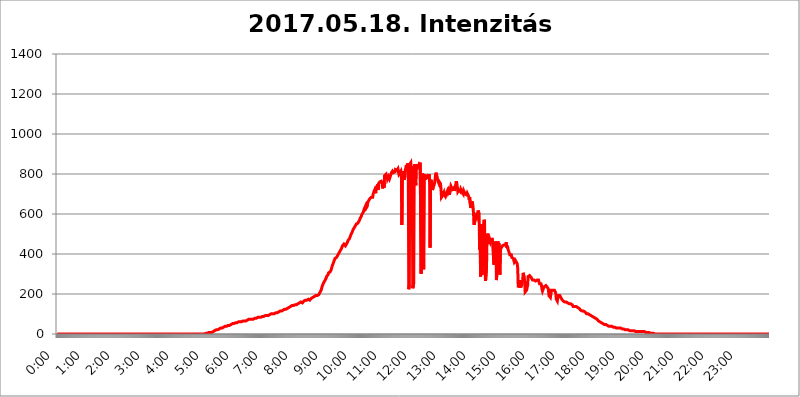
| Category | 2017.05.18. Intenzitás [W/m^2] |
|---|---|
| 0.0 | 0 |
| 0.0006944444444444445 | 0 |
| 0.001388888888888889 | 0 |
| 0.0020833333333333333 | 0 |
| 0.002777777777777778 | 0 |
| 0.003472222222222222 | 0 |
| 0.004166666666666667 | 0 |
| 0.004861111111111111 | 0 |
| 0.005555555555555556 | 0 |
| 0.0062499999999999995 | 0 |
| 0.006944444444444444 | 0 |
| 0.007638888888888889 | 0 |
| 0.008333333333333333 | 0 |
| 0.009027777777777779 | 0 |
| 0.009722222222222222 | 0 |
| 0.010416666666666666 | 0 |
| 0.011111111111111112 | 0 |
| 0.011805555555555555 | 0 |
| 0.012499999999999999 | 0 |
| 0.013194444444444444 | 0 |
| 0.013888888888888888 | 0 |
| 0.014583333333333332 | 0 |
| 0.015277777777777777 | 0 |
| 0.015972222222222224 | 0 |
| 0.016666666666666666 | 0 |
| 0.017361111111111112 | 0 |
| 0.018055555555555557 | 0 |
| 0.01875 | 0 |
| 0.019444444444444445 | 0 |
| 0.02013888888888889 | 0 |
| 0.020833333333333332 | 0 |
| 0.02152777777777778 | 0 |
| 0.022222222222222223 | 0 |
| 0.02291666666666667 | 0 |
| 0.02361111111111111 | 0 |
| 0.024305555555555556 | 0 |
| 0.024999999999999998 | 0 |
| 0.025694444444444447 | 0 |
| 0.02638888888888889 | 0 |
| 0.027083333333333334 | 0 |
| 0.027777777777777776 | 0 |
| 0.02847222222222222 | 0 |
| 0.029166666666666664 | 0 |
| 0.029861111111111113 | 0 |
| 0.030555555555555555 | 0 |
| 0.03125 | 0 |
| 0.03194444444444445 | 0 |
| 0.03263888888888889 | 0 |
| 0.03333333333333333 | 0 |
| 0.034027777777777775 | 0 |
| 0.034722222222222224 | 0 |
| 0.035416666666666666 | 0 |
| 0.036111111111111115 | 0 |
| 0.03680555555555556 | 0 |
| 0.0375 | 0 |
| 0.03819444444444444 | 0 |
| 0.03888888888888889 | 0 |
| 0.03958333333333333 | 0 |
| 0.04027777777777778 | 0 |
| 0.04097222222222222 | 0 |
| 0.041666666666666664 | 0 |
| 0.042361111111111106 | 0 |
| 0.04305555555555556 | 0 |
| 0.043750000000000004 | 0 |
| 0.044444444444444446 | 0 |
| 0.04513888888888889 | 0 |
| 0.04583333333333334 | 0 |
| 0.04652777777777778 | 0 |
| 0.04722222222222222 | 0 |
| 0.04791666666666666 | 0 |
| 0.04861111111111111 | 0 |
| 0.049305555555555554 | 0 |
| 0.049999999999999996 | 0 |
| 0.05069444444444445 | 0 |
| 0.051388888888888894 | 0 |
| 0.052083333333333336 | 0 |
| 0.05277777777777778 | 0 |
| 0.05347222222222222 | 0 |
| 0.05416666666666667 | 0 |
| 0.05486111111111111 | 0 |
| 0.05555555555555555 | 0 |
| 0.05625 | 0 |
| 0.05694444444444444 | 0 |
| 0.057638888888888885 | 0 |
| 0.05833333333333333 | 0 |
| 0.05902777777777778 | 0 |
| 0.059722222222222225 | 0 |
| 0.06041666666666667 | 0 |
| 0.061111111111111116 | 0 |
| 0.06180555555555556 | 0 |
| 0.0625 | 0 |
| 0.06319444444444444 | 0 |
| 0.06388888888888888 | 0 |
| 0.06458333333333334 | 0 |
| 0.06527777777777778 | 0 |
| 0.06597222222222222 | 0 |
| 0.06666666666666667 | 0 |
| 0.06736111111111111 | 0 |
| 0.06805555555555555 | 0 |
| 0.06874999999999999 | 0 |
| 0.06944444444444443 | 0 |
| 0.07013888888888889 | 0 |
| 0.07083333333333333 | 0 |
| 0.07152777777777779 | 0 |
| 0.07222222222222223 | 0 |
| 0.07291666666666667 | 0 |
| 0.07361111111111111 | 0 |
| 0.07430555555555556 | 0 |
| 0.075 | 0 |
| 0.07569444444444444 | 0 |
| 0.0763888888888889 | 0 |
| 0.07708333333333334 | 0 |
| 0.07777777777777778 | 0 |
| 0.07847222222222222 | 0 |
| 0.07916666666666666 | 0 |
| 0.0798611111111111 | 0 |
| 0.08055555555555556 | 0 |
| 0.08125 | 0 |
| 0.08194444444444444 | 0 |
| 0.08263888888888889 | 0 |
| 0.08333333333333333 | 0 |
| 0.08402777777777777 | 0 |
| 0.08472222222222221 | 0 |
| 0.08541666666666665 | 0 |
| 0.08611111111111112 | 0 |
| 0.08680555555555557 | 0 |
| 0.08750000000000001 | 0 |
| 0.08819444444444445 | 0 |
| 0.08888888888888889 | 0 |
| 0.08958333333333333 | 0 |
| 0.09027777777777778 | 0 |
| 0.09097222222222222 | 0 |
| 0.09166666666666667 | 0 |
| 0.09236111111111112 | 0 |
| 0.09305555555555556 | 0 |
| 0.09375 | 0 |
| 0.09444444444444444 | 0 |
| 0.09513888888888888 | 0 |
| 0.09583333333333333 | 0 |
| 0.09652777777777777 | 0 |
| 0.09722222222222222 | 0 |
| 0.09791666666666667 | 0 |
| 0.09861111111111111 | 0 |
| 0.09930555555555555 | 0 |
| 0.09999999999999999 | 0 |
| 0.10069444444444443 | 0 |
| 0.1013888888888889 | 0 |
| 0.10208333333333335 | 0 |
| 0.10277777777777779 | 0 |
| 0.10347222222222223 | 0 |
| 0.10416666666666667 | 0 |
| 0.10486111111111111 | 0 |
| 0.10555555555555556 | 0 |
| 0.10625 | 0 |
| 0.10694444444444444 | 0 |
| 0.1076388888888889 | 0 |
| 0.10833333333333334 | 0 |
| 0.10902777777777778 | 0 |
| 0.10972222222222222 | 0 |
| 0.1111111111111111 | 0 |
| 0.11180555555555556 | 0 |
| 0.11180555555555556 | 0 |
| 0.1125 | 0 |
| 0.11319444444444444 | 0 |
| 0.11388888888888889 | 0 |
| 0.11458333333333333 | 0 |
| 0.11527777777777777 | 0 |
| 0.11597222222222221 | 0 |
| 0.11666666666666665 | 0 |
| 0.1173611111111111 | 0 |
| 0.11805555555555557 | 0 |
| 0.11944444444444445 | 0 |
| 0.12013888888888889 | 0 |
| 0.12083333333333333 | 0 |
| 0.12152777777777778 | 0 |
| 0.12222222222222223 | 0 |
| 0.12291666666666667 | 0 |
| 0.12291666666666667 | 0 |
| 0.12361111111111112 | 0 |
| 0.12430555555555556 | 0 |
| 0.125 | 0 |
| 0.12569444444444444 | 0 |
| 0.12638888888888888 | 0 |
| 0.12708333333333333 | 0 |
| 0.16875 | 0 |
| 0.12847222222222224 | 0 |
| 0.12916666666666668 | 0 |
| 0.12986111111111112 | 0 |
| 0.13055555555555556 | 0 |
| 0.13125 | 0 |
| 0.13194444444444445 | 0 |
| 0.1326388888888889 | 0 |
| 0.13333333333333333 | 0 |
| 0.13402777777777777 | 0 |
| 0.13402777777777777 | 0 |
| 0.13472222222222222 | 0 |
| 0.13541666666666666 | 0 |
| 0.1361111111111111 | 0 |
| 0.13749999999999998 | 0 |
| 0.13819444444444443 | 0 |
| 0.1388888888888889 | 0 |
| 0.13958333333333334 | 0 |
| 0.14027777777777778 | 0 |
| 0.14097222222222222 | 0 |
| 0.14166666666666666 | 0 |
| 0.1423611111111111 | 0 |
| 0.14305555555555557 | 0 |
| 0.14375000000000002 | 0 |
| 0.14444444444444446 | 0 |
| 0.1451388888888889 | 0 |
| 0.1451388888888889 | 0 |
| 0.14652777777777778 | 0 |
| 0.14722222222222223 | 0 |
| 0.14791666666666667 | 0 |
| 0.1486111111111111 | 0 |
| 0.14930555555555555 | 0 |
| 0.15 | 0 |
| 0.15069444444444444 | 0 |
| 0.15138888888888888 | 0 |
| 0.15208333333333332 | 0 |
| 0.15277777777777776 | 0 |
| 0.15347222222222223 | 0 |
| 0.15416666666666667 | 0 |
| 0.15486111111111112 | 0 |
| 0.15555555555555556 | 0 |
| 0.15625 | 0 |
| 0.15694444444444444 | 0 |
| 0.15763888888888888 | 0 |
| 0.15833333333333333 | 0 |
| 0.15902777777777777 | 0 |
| 0.15972222222222224 | 0 |
| 0.16041666666666668 | 0 |
| 0.16111111111111112 | 0 |
| 0.16180555555555556 | 0 |
| 0.1625 | 0 |
| 0.16319444444444445 | 0 |
| 0.1638888888888889 | 0 |
| 0.16458333333333333 | 0 |
| 0.16527777777777777 | 0 |
| 0.16597222222222222 | 0 |
| 0.16666666666666666 | 0 |
| 0.1673611111111111 | 0 |
| 0.16805555555555554 | 0 |
| 0.16874999999999998 | 0 |
| 0.16944444444444443 | 0 |
| 0.17013888888888887 | 0 |
| 0.1708333333333333 | 0 |
| 0.17152777777777775 | 0 |
| 0.17222222222222225 | 0 |
| 0.1729166666666667 | 0 |
| 0.17361111111111113 | 0 |
| 0.17430555555555557 | 0 |
| 0.17500000000000002 | 0 |
| 0.17569444444444446 | 0 |
| 0.1763888888888889 | 0 |
| 0.17708333333333334 | 0 |
| 0.17777777777777778 | 0 |
| 0.17847222222222223 | 0 |
| 0.17916666666666667 | 0 |
| 0.1798611111111111 | 0 |
| 0.18055555555555555 | 0 |
| 0.18125 | 0 |
| 0.18194444444444444 | 0 |
| 0.1826388888888889 | 0 |
| 0.18333333333333335 | 0 |
| 0.1840277777777778 | 0 |
| 0.18472222222222223 | 0 |
| 0.18541666666666667 | 0 |
| 0.18611111111111112 | 0 |
| 0.18680555555555556 | 0 |
| 0.1875 | 0 |
| 0.18819444444444444 | 0 |
| 0.18888888888888888 | 0 |
| 0.18958333333333333 | 0 |
| 0.19027777777777777 | 0 |
| 0.1909722222222222 | 0 |
| 0.19166666666666665 | 0 |
| 0.19236111111111112 | 0 |
| 0.19305555555555554 | 0 |
| 0.19375 | 0 |
| 0.19444444444444445 | 0 |
| 0.1951388888888889 | 0 |
| 0.19583333333333333 | 0 |
| 0.19652777777777777 | 0 |
| 0.19722222222222222 | 0 |
| 0.19791666666666666 | 0 |
| 0.1986111111111111 | 0 |
| 0.19930555555555554 | 0 |
| 0.19999999999999998 | 0 |
| 0.20069444444444443 | 0 |
| 0.20138888888888887 | 0 |
| 0.2020833333333333 | 0 |
| 0.2027777777777778 | 0 |
| 0.2034722222222222 | 0 |
| 0.2041666666666667 | 0 |
| 0.20486111111111113 | 0 |
| 0.20555555555555557 | 0 |
| 0.20625000000000002 | 0 |
| 0.20694444444444446 | 3.525 |
| 0.2076388888888889 | 3.525 |
| 0.20833333333333334 | 3.525 |
| 0.20902777777777778 | 3.525 |
| 0.20972222222222223 | 3.525 |
| 0.21041666666666667 | 3.525 |
| 0.2111111111111111 | 3.525 |
| 0.21180555555555555 | 3.525 |
| 0.2125 | 7.887 |
| 0.21319444444444444 | 3.525 |
| 0.2138888888888889 | 7.887 |
| 0.21458333333333335 | 7.887 |
| 0.2152777777777778 | 7.887 |
| 0.21597222222222223 | 7.887 |
| 0.21666666666666667 | 7.887 |
| 0.21736111111111112 | 12.257 |
| 0.21805555555555556 | 12.257 |
| 0.21875 | 12.257 |
| 0.21944444444444444 | 12.257 |
| 0.22013888888888888 | 12.257 |
| 0.22083333333333333 | 16.636 |
| 0.22152777777777777 | 16.636 |
| 0.2222222222222222 | 16.636 |
| 0.22291666666666665 | 21.024 |
| 0.2236111111111111 | 21.024 |
| 0.22430555555555556 | 21.024 |
| 0.225 | 21.024 |
| 0.22569444444444445 | 21.024 |
| 0.2263888888888889 | 25.419 |
| 0.22708333333333333 | 25.419 |
| 0.22777777777777777 | 25.419 |
| 0.22847222222222222 | 25.419 |
| 0.22916666666666666 | 29.823 |
| 0.2298611111111111 | 29.823 |
| 0.23055555555555554 | 29.823 |
| 0.23124999999999998 | 29.823 |
| 0.23194444444444443 | 34.234 |
| 0.23263888888888887 | 34.234 |
| 0.2333333333333333 | 34.234 |
| 0.2340277777777778 | 38.653 |
| 0.2347222222222222 | 38.653 |
| 0.2354166666666667 | 38.653 |
| 0.23611111111111113 | 38.653 |
| 0.23680555555555557 | 38.653 |
| 0.23750000000000002 | 38.653 |
| 0.23819444444444446 | 38.653 |
| 0.2388888888888889 | 43.079 |
| 0.23958333333333334 | 43.079 |
| 0.24027777777777778 | 43.079 |
| 0.24097222222222223 | 43.079 |
| 0.24166666666666667 | 43.079 |
| 0.2423611111111111 | 47.511 |
| 0.24305555555555555 | 47.511 |
| 0.24375 | 47.511 |
| 0.24444444444444446 | 47.511 |
| 0.24513888888888888 | 47.511 |
| 0.24583333333333335 | 51.951 |
| 0.2465277777777778 | 51.951 |
| 0.24722222222222223 | 51.951 |
| 0.24791666666666667 | 51.951 |
| 0.24861111111111112 | 51.951 |
| 0.24930555555555556 | 51.951 |
| 0.25 | 56.398 |
| 0.25069444444444444 | 56.398 |
| 0.2513888888888889 | 56.398 |
| 0.2520833333333333 | 56.398 |
| 0.25277777777777777 | 56.398 |
| 0.2534722222222222 | 56.398 |
| 0.25416666666666665 | 60.85 |
| 0.2548611111111111 | 60.85 |
| 0.2555555555555556 | 60.85 |
| 0.25625000000000003 | 60.85 |
| 0.2569444444444445 | 60.85 |
| 0.2576388888888889 | 60.85 |
| 0.25833333333333336 | 60.85 |
| 0.2590277777777778 | 65.31 |
| 0.25972222222222224 | 65.31 |
| 0.2604166666666667 | 65.31 |
| 0.2611111111111111 | 65.31 |
| 0.26180555555555557 | 65.31 |
| 0.2625 | 65.31 |
| 0.26319444444444445 | 65.31 |
| 0.2638888888888889 | 65.31 |
| 0.26458333333333334 | 65.31 |
| 0.2652777777777778 | 60.85 |
| 0.2659722222222222 | 65.31 |
| 0.26666666666666666 | 69.775 |
| 0.2673611111111111 | 69.775 |
| 0.26805555555555555 | 69.775 |
| 0.26875 | 74.246 |
| 0.26944444444444443 | 74.246 |
| 0.2701388888888889 | 74.246 |
| 0.2708333333333333 | 74.246 |
| 0.27152777777777776 | 74.246 |
| 0.2722222222222222 | 74.246 |
| 0.27291666666666664 | 74.246 |
| 0.2736111111111111 | 74.246 |
| 0.2743055555555555 | 74.246 |
| 0.27499999999999997 | 74.246 |
| 0.27569444444444446 | 74.246 |
| 0.27638888888888885 | 74.246 |
| 0.27708333333333335 | 78.722 |
| 0.2777777777777778 | 78.722 |
| 0.27847222222222223 | 78.722 |
| 0.2791666666666667 | 78.722 |
| 0.2798611111111111 | 78.722 |
| 0.28055555555555556 | 83.205 |
| 0.28125 | 83.205 |
| 0.28194444444444444 | 83.205 |
| 0.2826388888888889 | 83.205 |
| 0.2833333333333333 | 83.205 |
| 0.28402777777777777 | 83.205 |
| 0.2847222222222222 | 83.205 |
| 0.28541666666666665 | 83.205 |
| 0.28611111111111115 | 83.205 |
| 0.28680555555555554 | 87.692 |
| 0.28750000000000003 | 87.692 |
| 0.2881944444444445 | 87.692 |
| 0.2888888888888889 | 87.692 |
| 0.28958333333333336 | 87.692 |
| 0.2902777777777778 | 92.184 |
| 0.29097222222222224 | 92.184 |
| 0.2916666666666667 | 92.184 |
| 0.2923611111111111 | 92.184 |
| 0.29305555555555557 | 92.184 |
| 0.29375 | 92.184 |
| 0.29444444444444445 | 92.184 |
| 0.2951388888888889 | 92.184 |
| 0.29583333333333334 | 92.184 |
| 0.2965277777777778 | 92.184 |
| 0.2972222222222222 | 92.184 |
| 0.29791666666666666 | 96.682 |
| 0.2986111111111111 | 96.682 |
| 0.29930555555555555 | 96.682 |
| 0.3 | 101.184 |
| 0.30069444444444443 | 101.184 |
| 0.3013888888888889 | 101.184 |
| 0.3020833333333333 | 101.184 |
| 0.30277777777777776 | 101.184 |
| 0.3034722222222222 | 101.184 |
| 0.30416666666666664 | 101.184 |
| 0.3048611111111111 | 101.184 |
| 0.3055555555555555 | 105.69 |
| 0.30624999999999997 | 105.69 |
| 0.3069444444444444 | 105.69 |
| 0.3076388888888889 | 105.69 |
| 0.30833333333333335 | 105.69 |
| 0.3090277777777778 | 110.201 |
| 0.30972222222222223 | 110.201 |
| 0.3104166666666667 | 110.201 |
| 0.3111111111111111 | 110.201 |
| 0.31180555555555556 | 114.716 |
| 0.3125 | 114.716 |
| 0.31319444444444444 | 114.716 |
| 0.3138888888888889 | 114.716 |
| 0.3145833333333333 | 114.716 |
| 0.31527777777777777 | 119.235 |
| 0.3159722222222222 | 119.235 |
| 0.31666666666666665 | 119.235 |
| 0.31736111111111115 | 119.235 |
| 0.31805555555555554 | 123.758 |
| 0.31875000000000003 | 123.758 |
| 0.3194444444444445 | 123.758 |
| 0.3201388888888889 | 123.758 |
| 0.32083333333333336 | 123.758 |
| 0.3215277777777778 | 128.284 |
| 0.32222222222222224 | 128.284 |
| 0.3229166666666667 | 128.284 |
| 0.3236111111111111 | 128.284 |
| 0.32430555555555557 | 128.284 |
| 0.325 | 132.814 |
| 0.32569444444444445 | 132.814 |
| 0.3263888888888889 | 137.347 |
| 0.32708333333333334 | 137.347 |
| 0.3277777777777778 | 137.347 |
| 0.3284722222222222 | 137.347 |
| 0.32916666666666666 | 141.884 |
| 0.3298611111111111 | 141.884 |
| 0.33055555555555555 | 141.884 |
| 0.33125 | 141.884 |
| 0.33194444444444443 | 146.423 |
| 0.3326388888888889 | 146.423 |
| 0.3333333333333333 | 146.423 |
| 0.3340277777777778 | 146.423 |
| 0.3347222222222222 | 146.423 |
| 0.3354166666666667 | 146.423 |
| 0.3361111111111111 | 150.964 |
| 0.3368055555555556 | 150.964 |
| 0.33749999999999997 | 150.964 |
| 0.33819444444444446 | 150.964 |
| 0.33888888888888885 | 155.509 |
| 0.33958333333333335 | 155.509 |
| 0.34027777777777773 | 155.509 |
| 0.34097222222222223 | 155.509 |
| 0.3416666666666666 | 160.056 |
| 0.3423611111111111 | 160.056 |
| 0.3430555555555555 | 160.056 |
| 0.34375 | 155.509 |
| 0.3444444444444445 | 155.509 |
| 0.3451388888888889 | 160.056 |
| 0.3458333333333334 | 164.605 |
| 0.34652777777777777 | 164.605 |
| 0.34722222222222227 | 169.156 |
| 0.34791666666666665 | 169.156 |
| 0.34861111111111115 | 169.156 |
| 0.34930555555555554 | 169.156 |
| 0.35000000000000003 | 169.156 |
| 0.3506944444444444 | 169.156 |
| 0.3513888888888889 | 169.156 |
| 0.3520833333333333 | 173.709 |
| 0.3527777777777778 | 173.709 |
| 0.3534722222222222 | 178.264 |
| 0.3541666666666667 | 169.156 |
| 0.3548611111111111 | 173.709 |
| 0.35555555555555557 | 173.709 |
| 0.35625 | 178.264 |
| 0.35694444444444445 | 178.264 |
| 0.3576388888888889 | 182.82 |
| 0.35833333333333334 | 182.82 |
| 0.3590277777777778 | 182.82 |
| 0.3597222222222222 | 187.378 |
| 0.36041666666666666 | 187.378 |
| 0.3611111111111111 | 187.378 |
| 0.36180555555555555 | 191.937 |
| 0.3625 | 191.937 |
| 0.36319444444444443 | 191.937 |
| 0.3638888888888889 | 191.937 |
| 0.3645833333333333 | 191.937 |
| 0.3652777777777778 | 196.497 |
| 0.3659722222222222 | 196.497 |
| 0.3666666666666667 | 196.497 |
| 0.3673611111111111 | 201.058 |
| 0.3680555555555556 | 196.497 |
| 0.36874999999999997 | 210.182 |
| 0.36944444444444446 | 214.746 |
| 0.37013888888888885 | 219.309 |
| 0.37083333333333335 | 223.873 |
| 0.37152777777777773 | 237.564 |
| 0.37222222222222223 | 242.127 |
| 0.3729166666666666 | 251.251 |
| 0.3736111111111111 | 255.813 |
| 0.3743055555555555 | 260.373 |
| 0.375 | 264.932 |
| 0.3756944444444445 | 269.49 |
| 0.3763888888888889 | 274.047 |
| 0.3770833333333334 | 278.603 |
| 0.37777777777777777 | 287.709 |
| 0.37847222222222227 | 292.259 |
| 0.37916666666666665 | 292.259 |
| 0.37986111111111115 | 296.808 |
| 0.38055555555555554 | 305.898 |
| 0.38125000000000003 | 305.898 |
| 0.3819444444444444 | 310.44 |
| 0.3826388888888889 | 310.44 |
| 0.3833333333333333 | 314.98 |
| 0.3840277777777778 | 319.517 |
| 0.3847222222222222 | 328.584 |
| 0.3854166666666667 | 337.639 |
| 0.3861111111111111 | 342.162 |
| 0.38680555555555557 | 351.198 |
| 0.3875 | 355.712 |
| 0.38819444444444445 | 364.728 |
| 0.3888888888888889 | 369.23 |
| 0.38958333333333334 | 378.224 |
| 0.3902777777777778 | 378.224 |
| 0.3909722222222222 | 382.715 |
| 0.39166666666666666 | 382.715 |
| 0.3923611111111111 | 382.715 |
| 0.39305555555555555 | 391.685 |
| 0.39375 | 391.685 |
| 0.39444444444444443 | 396.164 |
| 0.3951388888888889 | 405.108 |
| 0.3958333333333333 | 409.574 |
| 0.3965277777777778 | 409.574 |
| 0.3972222222222222 | 418.492 |
| 0.3979166666666667 | 422.943 |
| 0.3986111111111111 | 427.39 |
| 0.3993055555555556 | 431.833 |
| 0.39999999999999997 | 440.702 |
| 0.40069444444444446 | 440.702 |
| 0.40138888888888885 | 445.129 |
| 0.40208333333333335 | 449.551 |
| 0.40277777777777773 | 445.129 |
| 0.40347222222222223 | 445.129 |
| 0.4041666666666666 | 440.702 |
| 0.4048611111111111 | 445.129 |
| 0.4055555555555555 | 449.551 |
| 0.40625 | 445.129 |
| 0.4069444444444445 | 458.38 |
| 0.4076388888888889 | 467.187 |
| 0.4083333333333334 | 471.582 |
| 0.40902777777777777 | 471.582 |
| 0.40972222222222227 | 475.972 |
| 0.41041666666666665 | 480.356 |
| 0.41111111111111115 | 489.108 |
| 0.41180555555555554 | 484.735 |
| 0.41250000000000003 | 502.192 |
| 0.4131944444444444 | 506.542 |
| 0.4138888888888889 | 510.885 |
| 0.4145833333333333 | 519.555 |
| 0.4152777777777778 | 523.88 |
| 0.4159722222222222 | 528.2 |
| 0.4166666666666667 | 532.513 |
| 0.4173611111111111 | 536.82 |
| 0.41805555555555557 | 541.121 |
| 0.41875 | 541.121 |
| 0.41944444444444445 | 549.704 |
| 0.4201388888888889 | 549.704 |
| 0.42083333333333334 | 549.704 |
| 0.4215277777777778 | 553.986 |
| 0.4222222222222222 | 553.986 |
| 0.42291666666666666 | 558.261 |
| 0.4236111111111111 | 566.793 |
| 0.42430555555555555 | 571.049 |
| 0.425 | 579.542 |
| 0.42569444444444443 | 583.779 |
| 0.4263888888888889 | 588.009 |
| 0.4270833333333333 | 596.45 |
| 0.4277777777777778 | 600.661 |
| 0.4284722222222222 | 600.661 |
| 0.4291666666666667 | 609.062 |
| 0.4298611111111111 | 617.436 |
| 0.4305555555555556 | 625.784 |
| 0.43124999999999997 | 629.948 |
| 0.43194444444444446 | 625.784 |
| 0.43263888888888885 | 642.4 |
| 0.43333333333333335 | 629.948 |
| 0.43402777777777773 | 634.105 |
| 0.43472222222222223 | 638.256 |
| 0.4354166666666666 | 654.791 |
| 0.4361111111111111 | 663.019 |
| 0.4368055555555555 | 667.123 |
| 0.4375 | 667.123 |
| 0.4381944444444445 | 675.311 |
| 0.4388888888888889 | 671.22 |
| 0.4395833333333334 | 675.311 |
| 0.44027777777777777 | 683.473 |
| 0.44097222222222227 | 687.544 |
| 0.44166666666666665 | 679.395 |
| 0.44236111111111115 | 683.473 |
| 0.44305555555555554 | 699.717 |
| 0.44375000000000003 | 707.8 |
| 0.4444444444444444 | 711.832 |
| 0.4451388888888889 | 719.877 |
| 0.4458333333333333 | 715.858 |
| 0.4465277777777778 | 703.762 |
| 0.4472222222222222 | 727.896 |
| 0.4479166666666667 | 735.89 |
| 0.4486111111111111 | 735.89 |
| 0.44930555555555557 | 747.834 |
| 0.45 | 719.877 |
| 0.45069444444444445 | 751.803 |
| 0.4513888888888889 | 751.803 |
| 0.45208333333333334 | 759.723 |
| 0.4527777777777778 | 755.766 |
| 0.4534722222222222 | 755.766 |
| 0.45416666666666666 | 763.674 |
| 0.4548611111111111 | 759.723 |
| 0.45555555555555555 | 755.766 |
| 0.45625 | 727.896 |
| 0.45694444444444443 | 731.896 |
| 0.4576388888888889 | 751.803 |
| 0.4583333333333333 | 731.896 |
| 0.4590277777777778 | 791.169 |
| 0.4597222222222222 | 787.258 |
| 0.4604166666666667 | 787.258 |
| 0.4611111111111111 | 798.974 |
| 0.4618055555555556 | 787.258 |
| 0.46249999999999997 | 795.074 |
| 0.46319444444444446 | 775.492 |
| 0.46388888888888885 | 775.492 |
| 0.46458333333333335 | 787.258 |
| 0.46527777777777773 | 783.342 |
| 0.46597222222222223 | 775.492 |
| 0.4666666666666666 | 775.492 |
| 0.4673611111111111 | 791.169 |
| 0.4680555555555555 | 798.974 |
| 0.46875 | 806.757 |
| 0.4694444444444445 | 806.757 |
| 0.4701388888888889 | 814.519 |
| 0.4708333333333334 | 818.392 |
| 0.47152777777777777 | 806.757 |
| 0.47222222222222227 | 802.868 |
| 0.47291666666666665 | 806.757 |
| 0.47361111111111115 | 810.641 |
| 0.47430555555555554 | 822.26 |
| 0.47500000000000003 | 826.123 |
| 0.4756944444444444 | 826.123 |
| 0.4763888888888889 | 818.392 |
| 0.4770833333333333 | 822.26 |
| 0.4777777777777778 | 826.123 |
| 0.4784722222222222 | 810.641 |
| 0.4791666666666667 | 798.974 |
| 0.4798611111111111 | 798.974 |
| 0.48055555555555557 | 806.757 |
| 0.48125 | 806.757 |
| 0.48194444444444445 | 814.519 |
| 0.4826388888888889 | 791.169 |
| 0.48333333333333334 | 545.416 |
| 0.4840277777777778 | 798.974 |
| 0.4847222222222222 | 814.519 |
| 0.48541666666666666 | 791.169 |
| 0.4861111111111111 | 791.169 |
| 0.48680555555555555 | 771.559 |
| 0.4875 | 791.169 |
| 0.48819444444444443 | 822.26 |
| 0.4888888888888889 | 829.981 |
| 0.4895833333333333 | 845.365 |
| 0.4902777777777778 | 837.682 |
| 0.4909722222222222 | 845.365 |
| 0.4916666666666667 | 853.029 |
| 0.4923611111111111 | 783.342 |
| 0.4930555555555556 | 223.873 |
| 0.49374999999999997 | 246.689 |
| 0.49444444444444446 | 849.199 |
| 0.49513888888888885 | 853.029 |
| 0.49583333333333335 | 856.855 |
| 0.49652777777777773 | 822.26 |
| 0.49722222222222223 | 837.682 |
| 0.4979166666666666 | 829.981 |
| 0.4986111111111111 | 228.436 |
| 0.4993055555555555 | 228.436 |
| 0.5 | 255.813 |
| 0.5006944444444444 | 822.26 |
| 0.5013888888888889 | 849.199 |
| 0.5020833333333333 | 853.029 |
| 0.5027777777777778 | 743.859 |
| 0.5034722222222222 | 849.199 |
| 0.5041666666666667 | 822.26 |
| 0.5048611111111111 | 829.981 |
| 0.5055555555555555 | 829.981 |
| 0.50625 | 829.981 |
| 0.5069444444444444 | 845.365 |
| 0.5076388888888889 | 837.682 |
| 0.5083333333333333 | 849.199 |
| 0.5090277777777777 | 856.855 |
| 0.5097222222222222 | 860.676 |
| 0.5104166666666666 | 301.354 |
| 0.5111111111111112 | 296.808 |
| 0.5118055555555555 | 707.8 |
| 0.5125000000000001 | 802.868 |
| 0.5131944444444444 | 802.868 |
| 0.513888888888889 | 324.052 |
| 0.5145833333333333 | 791.169 |
| 0.5152777777777778 | 798.974 |
| 0.5159722222222222 | 771.559 |
| 0.5166666666666667 | 787.258 |
| 0.517361111111111 | 787.258 |
| 0.5180555555555556 | 783.342 |
| 0.5187499999999999 | 783.342 |
| 0.5194444444444445 | 795.074 |
| 0.5201388888888888 | 783.342 |
| 0.5208333333333334 | 787.258 |
| 0.5215277777777778 | 798.974 |
| 0.5222222222222223 | 759.723 |
| 0.5229166666666667 | 431.833 |
| 0.5236111111111111 | 755.766 |
| 0.5243055555555556 | 771.559 |
| 0.525 | 771.559 |
| 0.5256944444444445 | 727.896 |
| 0.5263888888888889 | 719.877 |
| 0.5270833333333333 | 731.896 |
| 0.5277777777777778 | 731.896 |
| 0.5284722222222222 | 743.859 |
| 0.5291666666666667 | 755.766 |
| 0.5298611111111111 | 771.559 |
| 0.5305555555555556 | 795.074 |
| 0.53125 | 806.757 |
| 0.5319444444444444 | 802.868 |
| 0.5326388888888889 | 802.868 |
| 0.5333333333333333 | 771.559 |
| 0.5340277777777778 | 771.559 |
| 0.5347222222222222 | 767.62 |
| 0.5354166666666667 | 751.803 |
| 0.5361111111111111 | 759.723 |
| 0.5368055555555555 | 759.723 |
| 0.5375 | 751.803 |
| 0.5381944444444444 | 727.896 |
| 0.5388888888888889 | 683.473 |
| 0.5395833333333333 | 687.544 |
| 0.5402777777777777 | 679.395 |
| 0.5409722222222222 | 695.666 |
| 0.5416666666666666 | 695.666 |
| 0.5423611111111112 | 707.8 |
| 0.5430555555555555 | 695.666 |
| 0.5437500000000001 | 691.608 |
| 0.5444444444444444 | 687.544 |
| 0.545138888888889 | 695.666 |
| 0.5458333333333333 | 703.762 |
| 0.5465277777777778 | 703.762 |
| 0.5472222222222222 | 715.858 |
| 0.5479166666666667 | 707.8 |
| 0.548611111111111 | 715.858 |
| 0.5493055555555556 | 715.858 |
| 0.5499999999999999 | 695.666 |
| 0.5506944444444445 | 711.832 |
| 0.5513888888888888 | 715.858 |
| 0.5520833333333334 | 739.877 |
| 0.5527777777777778 | 739.877 |
| 0.5534722222222223 | 743.859 |
| 0.5541666666666667 | 723.889 |
| 0.5548611111111111 | 719.877 |
| 0.5555555555555556 | 727.896 |
| 0.55625 | 731.896 |
| 0.5569444444444445 | 715.858 |
| 0.5576388888888889 | 723.889 |
| 0.5583333333333333 | 735.89 |
| 0.5590277777777778 | 735.89 |
| 0.5597222222222222 | 763.674 |
| 0.5604166666666667 | 751.803 |
| 0.5611111111111111 | 735.89 |
| 0.5618055555555556 | 711.832 |
| 0.5625 | 711.832 |
| 0.5631944444444444 | 719.877 |
| 0.5638888888888889 | 715.858 |
| 0.5645833333333333 | 723.889 |
| 0.5652777777777778 | 711.832 |
| 0.5659722222222222 | 723.889 |
| 0.5666666666666667 | 719.877 |
| 0.5673611111111111 | 723.889 |
| 0.5680555555555555 | 707.8 |
| 0.56875 | 703.762 |
| 0.5694444444444444 | 699.717 |
| 0.5701388888888889 | 715.858 |
| 0.5708333333333333 | 719.877 |
| 0.5715277777777777 | 719.877 |
| 0.5722222222222222 | 699.717 |
| 0.5729166666666666 | 703.762 |
| 0.5736111111111112 | 699.717 |
| 0.5743055555555555 | 695.666 |
| 0.5750000000000001 | 703.762 |
| 0.5756944444444444 | 703.762 |
| 0.576388888888889 | 699.717 |
| 0.5770833333333333 | 687.544 |
| 0.5777777777777778 | 671.22 |
| 0.5784722222222222 | 683.473 |
| 0.5791666666666667 | 650.667 |
| 0.579861111111111 | 629.948 |
| 0.5805555555555556 | 638.256 |
| 0.5812499999999999 | 642.4 |
| 0.5819444444444445 | 663.019 |
| 0.5826388888888888 | 650.667 |
| 0.5833333333333334 | 629.948 |
| 0.5840277777777778 | 634.105 |
| 0.5847222222222223 | 545.416 |
| 0.5854166666666667 | 604.864 |
| 0.5861111111111111 | 596.45 |
| 0.5868055555555556 | 592.233 |
| 0.5875 | 592.233 |
| 0.5881944444444445 | 579.542 |
| 0.5888888888888889 | 579.542 |
| 0.5895833333333333 | 600.661 |
| 0.5902777777777778 | 617.436 |
| 0.5909722222222222 | 621.613 |
| 0.5916666666666667 | 600.661 |
| 0.5923611111111111 | 422.943 |
| 0.5930555555555556 | 549.704 |
| 0.59375 | 287.709 |
| 0.5944444444444444 | 333.113 |
| 0.5951388888888889 | 453.968 |
| 0.5958333333333333 | 296.808 |
| 0.5965277777777778 | 536.82 |
| 0.5972222222222222 | 342.162 |
| 0.5979166666666667 | 549.704 |
| 0.5986111111111111 | 571.049 |
| 0.5993055555555555 | 562.53 |
| 0.6 | 314.98 |
| 0.6006944444444444 | 264.932 |
| 0.6013888888888889 | 269.49 |
| 0.6020833333333333 | 333.113 |
| 0.6027777777777777 | 484.735 |
| 0.6034722222222222 | 493.475 |
| 0.6041666666666666 | 502.192 |
| 0.6048611111111112 | 471.582 |
| 0.6055555555555555 | 449.551 |
| 0.6062500000000001 | 458.38 |
| 0.6069444444444444 | 467.187 |
| 0.607638888888889 | 458.38 |
| 0.6083333333333333 | 458.38 |
| 0.6090277777777778 | 471.582 |
| 0.6097222222222222 | 480.356 |
| 0.6104166666666667 | 462.786 |
| 0.611111111111111 | 462.786 |
| 0.6118055555555556 | 462.786 |
| 0.6124999999999999 | 346.682 |
| 0.6131944444444445 | 422.943 |
| 0.6138888888888888 | 462.786 |
| 0.6145833333333334 | 467.187 |
| 0.6152777777777778 | 449.551 |
| 0.6159722222222223 | 269.49 |
| 0.6166666666666667 | 310.44 |
| 0.6173611111111111 | 305.898 |
| 0.6180555555555556 | 462.786 |
| 0.61875 | 445.129 |
| 0.6194444444444445 | 453.968 |
| 0.6201388888888889 | 314.98 |
| 0.6208333333333333 | 296.808 |
| 0.6215277777777778 | 422.943 |
| 0.6222222222222222 | 440.702 |
| 0.6229166666666667 | 431.833 |
| 0.6236111111111111 | 431.833 |
| 0.6243055555555556 | 440.702 |
| 0.625 | 436.27 |
| 0.6256944444444444 | 436.27 |
| 0.6263888888888889 | 445.129 |
| 0.6270833333333333 | 440.702 |
| 0.6277777777777778 | 440.702 |
| 0.6284722222222222 | 445.129 |
| 0.6291666666666667 | 449.551 |
| 0.6298611111111111 | 458.38 |
| 0.6305555555555555 | 431.833 |
| 0.63125 | 440.702 |
| 0.6319444444444444 | 427.39 |
| 0.6326388888888889 | 422.943 |
| 0.6333333333333333 | 422.943 |
| 0.6340277777777777 | 405.108 |
| 0.6347222222222222 | 396.164 |
| 0.6354166666666666 | 400.638 |
| 0.6361111111111112 | 400.638 |
| 0.6368055555555555 | 396.164 |
| 0.6375000000000001 | 382.715 |
| 0.6381944444444444 | 378.224 |
| 0.638888888888889 | 378.224 |
| 0.6395833333333333 | 378.224 |
| 0.6402777777777778 | 369.23 |
| 0.6409722222222222 | 360.221 |
| 0.6416666666666667 | 364.728 |
| 0.642361111111111 | 369.23 |
| 0.6430555555555556 | 364.728 |
| 0.6437499999999999 | 360.221 |
| 0.6444444444444445 | 360.221 |
| 0.6451388888888888 | 351.198 |
| 0.6458333333333334 | 328.584 |
| 0.6465277777777778 | 233 |
| 0.6472222222222223 | 228.436 |
| 0.6479166666666667 | 242.127 |
| 0.6486111111111111 | 233 |
| 0.6493055555555556 | 269.49 |
| 0.65 | 233 |
| 0.6506944444444445 | 233 |
| 0.6513888888888889 | 237.564 |
| 0.6520833333333333 | 260.373 |
| 0.6527777777777778 | 269.49 |
| 0.6534722222222222 | 305.898 |
| 0.6541666666666667 | 296.808 |
| 0.6548611111111111 | 287.709 |
| 0.6555555555555556 | 264.932 |
| 0.65625 | 210.182 |
| 0.6569444444444444 | 210.182 |
| 0.6576388888888889 | 214.746 |
| 0.6583333333333333 | 219.309 |
| 0.6590277777777778 | 233 |
| 0.6597222222222222 | 242.127 |
| 0.6604166666666667 | 287.709 |
| 0.6611111111111111 | 287.709 |
| 0.6618055555555555 | 287.709 |
| 0.6625 | 292.259 |
| 0.6631944444444444 | 287.709 |
| 0.6638888888888889 | 287.709 |
| 0.6645833333333333 | 283.156 |
| 0.6652777777777777 | 278.603 |
| 0.6659722222222222 | 278.603 |
| 0.6666666666666666 | 269.49 |
| 0.6673611111111111 | 274.047 |
| 0.6680555555555556 | 274.047 |
| 0.6687500000000001 | 269.49 |
| 0.6694444444444444 | 274.047 |
| 0.6701388888888888 | 269.49 |
| 0.6708333333333334 | 264.932 |
| 0.6715277777777778 | 269.49 |
| 0.6722222222222222 | 264.932 |
| 0.6729166666666666 | 269.49 |
| 0.6736111111111112 | 269.49 |
| 0.6743055555555556 | 264.932 |
| 0.6749999999999999 | 269.49 |
| 0.6756944444444444 | 269.49 |
| 0.6763888888888889 | 251.251 |
| 0.6770833333333334 | 251.251 |
| 0.6777777777777777 | 246.689 |
| 0.6784722222222223 | 251.251 |
| 0.6791666666666667 | 242.127 |
| 0.6798611111111111 | 223.873 |
| 0.6805555555555555 | 214.746 |
| 0.68125 | 214.746 |
| 0.6819444444444445 | 228.436 |
| 0.6826388888888889 | 233 |
| 0.6833333333333332 | 237.564 |
| 0.6840277777777778 | 242.127 |
| 0.6847222222222222 | 242.127 |
| 0.6854166666666667 | 242.127 |
| 0.686111111111111 | 242.127 |
| 0.6868055555555556 | 242.127 |
| 0.6875 | 233 |
| 0.6881944444444444 | 233 |
| 0.688888888888889 | 223.873 |
| 0.6895833333333333 | 191.937 |
| 0.6902777777777778 | 187.378 |
| 0.6909722222222222 | 187.378 |
| 0.6916666666666668 | 182.82 |
| 0.6923611111111111 | 201.058 |
| 0.6930555555555555 | 219.309 |
| 0.69375 | 219.309 |
| 0.6944444444444445 | 219.309 |
| 0.6951388888888889 | 219.309 |
| 0.6958333333333333 | 219.309 |
| 0.6965277777777777 | 219.309 |
| 0.6972222222222223 | 219.309 |
| 0.6979166666666666 | 219.309 |
| 0.6986111111111111 | 210.182 |
| 0.6993055555555556 | 201.058 |
| 0.7000000000000001 | 173.709 |
| 0.7006944444444444 | 169.156 |
| 0.7013888888888888 | 164.605 |
| 0.7020833333333334 | 182.82 |
| 0.7027777777777778 | 191.937 |
| 0.7034722222222222 | 191.937 |
| 0.7041666666666666 | 187.378 |
| 0.7048611111111112 | 191.937 |
| 0.7055555555555556 | 187.378 |
| 0.7062499999999999 | 182.82 |
| 0.7069444444444444 | 178.264 |
| 0.7076388888888889 | 173.709 |
| 0.7083333333333334 | 173.709 |
| 0.7090277777777777 | 169.156 |
| 0.7097222222222223 | 164.605 |
| 0.7104166666666667 | 164.605 |
| 0.7111111111111111 | 160.056 |
| 0.7118055555555555 | 160.056 |
| 0.7125 | 155.509 |
| 0.7131944444444445 | 155.509 |
| 0.7138888888888889 | 160.056 |
| 0.7145833333333332 | 155.509 |
| 0.7152777777777778 | 155.509 |
| 0.7159722222222222 | 155.509 |
| 0.7166666666666667 | 155.509 |
| 0.717361111111111 | 155.509 |
| 0.7180555555555556 | 150.964 |
| 0.71875 | 155.509 |
| 0.7194444444444444 | 150.964 |
| 0.720138888888889 | 150.964 |
| 0.7208333333333333 | 150.964 |
| 0.7215277777777778 | 146.423 |
| 0.7222222222222222 | 146.423 |
| 0.7229166666666668 | 141.884 |
| 0.7236111111111111 | 137.347 |
| 0.7243055555555555 | 137.347 |
| 0.725 | 137.347 |
| 0.7256944444444445 | 137.347 |
| 0.7263888888888889 | 137.347 |
| 0.7270833333333333 | 137.347 |
| 0.7277777777777777 | 137.347 |
| 0.7284722222222223 | 137.347 |
| 0.7291666666666666 | 132.814 |
| 0.7298611111111111 | 132.814 |
| 0.7305555555555556 | 128.284 |
| 0.7312500000000001 | 128.284 |
| 0.7319444444444444 | 128.284 |
| 0.7326388888888888 | 123.758 |
| 0.7333333333333334 | 123.758 |
| 0.7340277777777778 | 119.235 |
| 0.7347222222222222 | 119.235 |
| 0.7354166666666666 | 119.235 |
| 0.7361111111111112 | 114.716 |
| 0.7368055555555556 | 114.716 |
| 0.7374999999999999 | 110.201 |
| 0.7381944444444444 | 114.716 |
| 0.7388888888888889 | 110.201 |
| 0.7395833333333334 | 110.201 |
| 0.7402777777777777 | 110.201 |
| 0.7409722222222223 | 105.69 |
| 0.7416666666666667 | 105.69 |
| 0.7423611111111111 | 101.184 |
| 0.7430555555555555 | 101.184 |
| 0.74375 | 101.184 |
| 0.7444444444444445 | 101.184 |
| 0.7451388888888889 | 101.184 |
| 0.7458333333333332 | 101.184 |
| 0.7465277777777778 | 96.682 |
| 0.7472222222222222 | 96.682 |
| 0.7479166666666667 | 92.184 |
| 0.748611111111111 | 92.184 |
| 0.7493055555555556 | 92.184 |
| 0.75 | 87.692 |
| 0.7506944444444444 | 87.692 |
| 0.751388888888889 | 87.692 |
| 0.7520833333333333 | 87.692 |
| 0.7527777777777778 | 83.205 |
| 0.7534722222222222 | 83.205 |
| 0.7541666666666668 | 83.205 |
| 0.7548611111111111 | 78.722 |
| 0.7555555555555555 | 78.722 |
| 0.75625 | 78.722 |
| 0.7569444444444445 | 74.246 |
| 0.7576388888888889 | 69.775 |
| 0.7583333333333333 | 69.775 |
| 0.7590277777777777 | 65.31 |
| 0.7597222222222223 | 65.31 |
| 0.7604166666666666 | 65.31 |
| 0.7611111111111111 | 60.85 |
| 0.7618055555555556 | 60.85 |
| 0.7625000000000001 | 56.398 |
| 0.7631944444444444 | 56.398 |
| 0.7638888888888888 | 56.398 |
| 0.7645833333333334 | 56.398 |
| 0.7652777777777778 | 51.951 |
| 0.7659722222222222 | 51.951 |
| 0.7666666666666666 | 51.951 |
| 0.7673611111111112 | 47.511 |
| 0.7680555555555556 | 47.511 |
| 0.7687499999999999 | 47.511 |
| 0.7694444444444444 | 47.511 |
| 0.7701388888888889 | 47.511 |
| 0.7708333333333334 | 43.079 |
| 0.7715277777777777 | 43.079 |
| 0.7722222222222223 | 43.079 |
| 0.7729166666666667 | 43.079 |
| 0.7736111111111111 | 38.653 |
| 0.7743055555555555 | 38.653 |
| 0.775 | 38.653 |
| 0.7756944444444445 | 38.653 |
| 0.7763888888888889 | 38.653 |
| 0.7770833333333332 | 38.653 |
| 0.7777777777777778 | 38.653 |
| 0.7784722222222222 | 38.653 |
| 0.7791666666666667 | 34.234 |
| 0.779861111111111 | 34.234 |
| 0.7805555555555556 | 34.234 |
| 0.78125 | 34.234 |
| 0.7819444444444444 | 34.234 |
| 0.782638888888889 | 34.234 |
| 0.7833333333333333 | 29.823 |
| 0.7840277777777778 | 29.823 |
| 0.7847222222222222 | 29.823 |
| 0.7854166666666668 | 29.823 |
| 0.7861111111111111 | 29.823 |
| 0.7868055555555555 | 29.823 |
| 0.7875 | 29.823 |
| 0.7881944444444445 | 29.823 |
| 0.7888888888888889 | 29.823 |
| 0.7895833333333333 | 25.419 |
| 0.7902777777777777 | 29.823 |
| 0.7909722222222223 | 25.419 |
| 0.7916666666666666 | 25.419 |
| 0.7923611111111111 | 25.419 |
| 0.7930555555555556 | 25.419 |
| 0.7937500000000001 | 25.419 |
| 0.7944444444444444 | 25.419 |
| 0.7951388888888888 | 25.419 |
| 0.7958333333333334 | 21.024 |
| 0.7965277777777778 | 21.024 |
| 0.7972222222222222 | 21.024 |
| 0.7979166666666666 | 21.024 |
| 0.7986111111111112 | 21.024 |
| 0.7993055555555556 | 21.024 |
| 0.7999999999999999 | 21.024 |
| 0.8006944444444444 | 21.024 |
| 0.8013888888888889 | 21.024 |
| 0.8020833333333334 | 21.024 |
| 0.8027777777777777 | 16.636 |
| 0.8034722222222223 | 16.636 |
| 0.8041666666666667 | 16.636 |
| 0.8048611111111111 | 16.636 |
| 0.8055555555555555 | 16.636 |
| 0.80625 | 16.636 |
| 0.8069444444444445 | 16.636 |
| 0.8076388888888889 | 16.636 |
| 0.8083333333333332 | 16.636 |
| 0.8090277777777778 | 16.636 |
| 0.8097222222222222 | 12.257 |
| 0.8104166666666667 | 12.257 |
| 0.811111111111111 | 12.257 |
| 0.8118055555555556 | 12.257 |
| 0.8125 | 12.257 |
| 0.8131944444444444 | 12.257 |
| 0.813888888888889 | 12.257 |
| 0.8145833333333333 | 12.257 |
| 0.8152777777777778 | 12.257 |
| 0.8159722222222222 | 12.257 |
| 0.8166666666666668 | 12.257 |
| 0.8173611111111111 | 12.257 |
| 0.8180555555555555 | 12.257 |
| 0.81875 | 12.257 |
| 0.8194444444444445 | 12.257 |
| 0.8201388888888889 | 12.257 |
| 0.8208333333333333 | 12.257 |
| 0.8215277777777777 | 12.257 |
| 0.8222222222222223 | 12.257 |
| 0.8229166666666666 | 12.257 |
| 0.8236111111111111 | 12.257 |
| 0.8243055555555556 | 12.257 |
| 0.8250000000000001 | 7.887 |
| 0.8256944444444444 | 7.887 |
| 0.8263888888888888 | 7.887 |
| 0.8270833333333334 | 7.887 |
| 0.8277777777777778 | 7.887 |
| 0.8284722222222222 | 7.887 |
| 0.8291666666666666 | 7.887 |
| 0.8298611111111112 | 7.887 |
| 0.8305555555555556 | 3.525 |
| 0.8312499999999999 | 3.525 |
| 0.8319444444444444 | 3.525 |
| 0.8326388888888889 | 3.525 |
| 0.8333333333333334 | 3.525 |
| 0.8340277777777777 | 3.525 |
| 0.8347222222222223 | 3.525 |
| 0.8354166666666667 | 3.525 |
| 0.8361111111111111 | 3.525 |
| 0.8368055555555555 | 3.525 |
| 0.8375 | 3.525 |
| 0.8381944444444445 | 0 |
| 0.8388888888888889 | 0 |
| 0.8395833333333332 | 0 |
| 0.8402777777777778 | 0 |
| 0.8409722222222222 | 0 |
| 0.8416666666666667 | 0 |
| 0.842361111111111 | 0 |
| 0.8430555555555556 | 0 |
| 0.84375 | 0 |
| 0.8444444444444444 | 0 |
| 0.845138888888889 | 0 |
| 0.8458333333333333 | 0 |
| 0.8465277777777778 | 0 |
| 0.8472222222222222 | 0 |
| 0.8479166666666668 | 0 |
| 0.8486111111111111 | 0 |
| 0.8493055555555555 | 0 |
| 0.85 | 0 |
| 0.8506944444444445 | 0 |
| 0.8513888888888889 | 0 |
| 0.8520833333333333 | 0 |
| 0.8527777777777777 | 0 |
| 0.8534722222222223 | 0 |
| 0.8541666666666666 | 0 |
| 0.8548611111111111 | 0 |
| 0.8555555555555556 | 0 |
| 0.8562500000000001 | 0 |
| 0.8569444444444444 | 0 |
| 0.8576388888888888 | 0 |
| 0.8583333333333334 | 0 |
| 0.8590277777777778 | 0 |
| 0.8597222222222222 | 0 |
| 0.8604166666666666 | 0 |
| 0.8611111111111112 | 0 |
| 0.8618055555555556 | 0 |
| 0.8624999999999999 | 0 |
| 0.8631944444444444 | 0 |
| 0.8638888888888889 | 0 |
| 0.8645833333333334 | 0 |
| 0.8652777777777777 | 0 |
| 0.8659722222222223 | 0 |
| 0.8666666666666667 | 0 |
| 0.8673611111111111 | 0 |
| 0.8680555555555555 | 0 |
| 0.86875 | 0 |
| 0.8694444444444445 | 0 |
| 0.8701388888888889 | 0 |
| 0.8708333333333332 | 0 |
| 0.8715277777777778 | 0 |
| 0.8722222222222222 | 0 |
| 0.8729166666666667 | 0 |
| 0.873611111111111 | 0 |
| 0.8743055555555556 | 0 |
| 0.875 | 0 |
| 0.8756944444444444 | 0 |
| 0.876388888888889 | 0 |
| 0.8770833333333333 | 0 |
| 0.8777777777777778 | 0 |
| 0.8784722222222222 | 0 |
| 0.8791666666666668 | 0 |
| 0.8798611111111111 | 0 |
| 0.8805555555555555 | 0 |
| 0.88125 | 0 |
| 0.8819444444444445 | 0 |
| 0.8826388888888889 | 0 |
| 0.8833333333333333 | 0 |
| 0.8840277777777777 | 0 |
| 0.8847222222222223 | 0 |
| 0.8854166666666666 | 0 |
| 0.8861111111111111 | 0 |
| 0.8868055555555556 | 0 |
| 0.8875000000000001 | 0 |
| 0.8881944444444444 | 0 |
| 0.8888888888888888 | 0 |
| 0.8895833333333334 | 0 |
| 0.8902777777777778 | 0 |
| 0.8909722222222222 | 0 |
| 0.8916666666666666 | 0 |
| 0.8923611111111112 | 0 |
| 0.8930555555555556 | 0 |
| 0.8937499999999999 | 0 |
| 0.8944444444444444 | 0 |
| 0.8951388888888889 | 0 |
| 0.8958333333333334 | 0 |
| 0.8965277777777777 | 0 |
| 0.8972222222222223 | 0 |
| 0.8979166666666667 | 0 |
| 0.8986111111111111 | 0 |
| 0.8993055555555555 | 0 |
| 0.9 | 0 |
| 0.9006944444444445 | 0 |
| 0.9013888888888889 | 0 |
| 0.9020833333333332 | 0 |
| 0.9027777777777778 | 0 |
| 0.9034722222222222 | 0 |
| 0.9041666666666667 | 0 |
| 0.904861111111111 | 0 |
| 0.9055555555555556 | 0 |
| 0.90625 | 0 |
| 0.9069444444444444 | 0 |
| 0.907638888888889 | 0 |
| 0.9083333333333333 | 0 |
| 0.9090277777777778 | 0 |
| 0.9097222222222222 | 0 |
| 0.9104166666666668 | 0 |
| 0.9111111111111111 | 0 |
| 0.9118055555555555 | 0 |
| 0.9125 | 0 |
| 0.9131944444444445 | 0 |
| 0.9138888888888889 | 0 |
| 0.9145833333333333 | 0 |
| 0.9152777777777777 | 0 |
| 0.9159722222222223 | 0 |
| 0.9166666666666666 | 0 |
| 0.9173611111111111 | 0 |
| 0.9180555555555556 | 0 |
| 0.9187500000000001 | 0 |
| 0.9194444444444444 | 0 |
| 0.9201388888888888 | 0 |
| 0.9208333333333334 | 0 |
| 0.9215277777777778 | 0 |
| 0.9222222222222222 | 0 |
| 0.9229166666666666 | 0 |
| 0.9236111111111112 | 0 |
| 0.9243055555555556 | 0 |
| 0.9249999999999999 | 0 |
| 0.9256944444444444 | 0 |
| 0.9263888888888889 | 0 |
| 0.9270833333333334 | 0 |
| 0.9277777777777777 | 0 |
| 0.9284722222222223 | 0 |
| 0.9291666666666667 | 0 |
| 0.9298611111111111 | 0 |
| 0.9305555555555555 | 0 |
| 0.93125 | 0 |
| 0.9319444444444445 | 0 |
| 0.9326388888888889 | 0 |
| 0.9333333333333332 | 0 |
| 0.9340277777777778 | 0 |
| 0.9347222222222222 | 0 |
| 0.9354166666666667 | 0 |
| 0.936111111111111 | 0 |
| 0.9368055555555556 | 0 |
| 0.9375 | 0 |
| 0.9381944444444444 | 0 |
| 0.938888888888889 | 0 |
| 0.9395833333333333 | 0 |
| 0.9402777777777778 | 0 |
| 0.9409722222222222 | 0 |
| 0.9416666666666668 | 0 |
| 0.9423611111111111 | 0 |
| 0.9430555555555555 | 0 |
| 0.94375 | 0 |
| 0.9444444444444445 | 0 |
| 0.9451388888888889 | 0 |
| 0.9458333333333333 | 0 |
| 0.9465277777777777 | 0 |
| 0.9472222222222223 | 0 |
| 0.9479166666666666 | 0 |
| 0.9486111111111111 | 0 |
| 0.9493055555555556 | 0 |
| 0.9500000000000001 | 0 |
| 0.9506944444444444 | 0 |
| 0.9513888888888888 | 0 |
| 0.9520833333333334 | 0 |
| 0.9527777777777778 | 0 |
| 0.9534722222222222 | 0 |
| 0.9541666666666666 | 0 |
| 0.9548611111111112 | 0 |
| 0.9555555555555556 | 0 |
| 0.9562499999999999 | 0 |
| 0.9569444444444444 | 0 |
| 0.9576388888888889 | 0 |
| 0.9583333333333334 | 0 |
| 0.9590277777777777 | 0 |
| 0.9597222222222223 | 0 |
| 0.9604166666666667 | 0 |
| 0.9611111111111111 | 0 |
| 0.9618055555555555 | 0 |
| 0.9625 | 0 |
| 0.9631944444444445 | 0 |
| 0.9638888888888889 | 0 |
| 0.9645833333333332 | 0 |
| 0.9652777777777778 | 0 |
| 0.9659722222222222 | 0 |
| 0.9666666666666667 | 0 |
| 0.967361111111111 | 0 |
| 0.9680555555555556 | 0 |
| 0.96875 | 0 |
| 0.9694444444444444 | 0 |
| 0.970138888888889 | 0 |
| 0.9708333333333333 | 0 |
| 0.9715277777777778 | 0 |
| 0.9722222222222222 | 0 |
| 0.9729166666666668 | 0 |
| 0.9736111111111111 | 0 |
| 0.9743055555555555 | 0 |
| 0.975 | 0 |
| 0.9756944444444445 | 0 |
| 0.9763888888888889 | 0 |
| 0.9770833333333333 | 0 |
| 0.9777777777777777 | 0 |
| 0.9784722222222223 | 0 |
| 0.9791666666666666 | 0 |
| 0.9798611111111111 | 0 |
| 0.9805555555555556 | 0 |
| 0.9812500000000001 | 0 |
| 0.9819444444444444 | 0 |
| 0.9826388888888888 | 0 |
| 0.9833333333333334 | 0 |
| 0.9840277777777778 | 0 |
| 0.9847222222222222 | 0 |
| 0.9854166666666666 | 0 |
| 0.9861111111111112 | 0 |
| 0.9868055555555556 | 0 |
| 0.9874999999999999 | 0 |
| 0.9881944444444444 | 0 |
| 0.9888888888888889 | 0 |
| 0.9895833333333334 | 0 |
| 0.9902777777777777 | 0 |
| 0.9909722222222223 | 0 |
| 0.9916666666666667 | 0 |
| 0.9923611111111111 | 0 |
| 0.9930555555555555 | 0 |
| 0.99375 | 0 |
| 0.9944444444444445 | 0 |
| 0.9951388888888889 | 0 |
| 0.9958333333333332 | 0 |
| 0.9965277777777778 | 0 |
| 0.9972222222222222 | 0 |
| 0.9979166666666667 | 0 |
| 0.998611111111111 | 0 |
| 0.9993055555555556 | 0 |